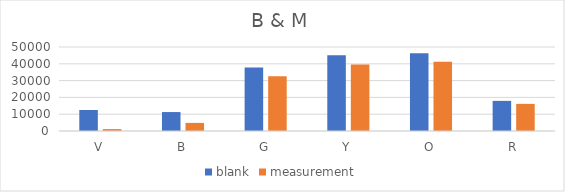
| Category | blank | measurement |
|---|---|---|
| V | 12513 | 1135 |
| B | 11280 | 4822 |
| G | 37803 | 32525 |
| Y | 45126 | 39590 |
| O | 46214 | 41151 |
| R | 17931 | 16153 |